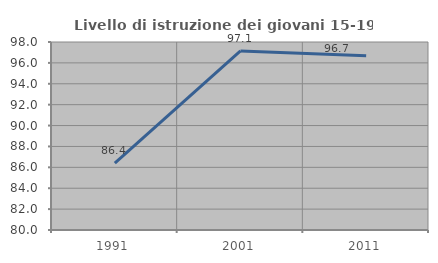
| Category | Livello di istruzione dei giovani 15-19 anni |
|---|---|
| 1991.0 | 86.413 |
| 2001.0 | 97.143 |
| 2011.0 | 96.694 |